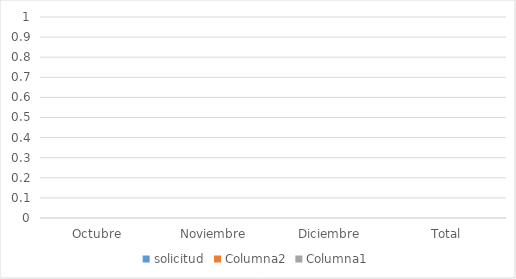
| Category | solicitud | Columna2 | Columna1 |
|---|---|---|---|
| Octubre | 0 |  |  |
| Noviembre | 0 |  |  |
| Diciembre | 0 |  |  |
| Total | 0 |  |  |